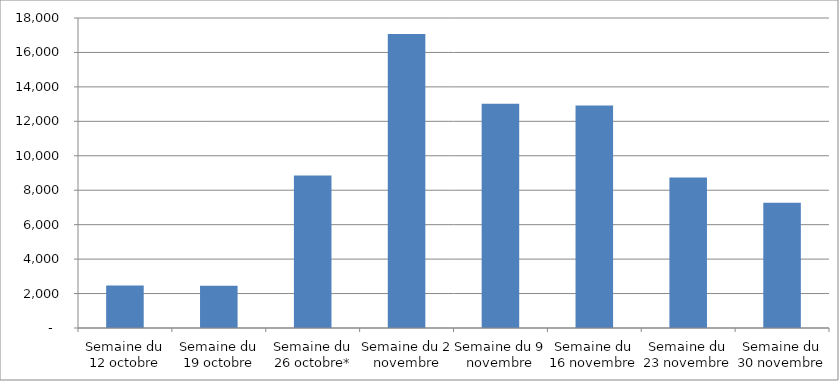
| Category | Series 0 |
|---|---|
| Semaine du 12 octobre | 2475 |
| Semaine du 19 octobre | 2449 |
| Semaine du 26 octobre* | 8849 |
| Semaine du 2 novembre | 17072 |
| Semaine du 9 novembre | 13023 |
| Semaine du 16 novembre | 12922 |
| Semaine du 23 novembre | 8732 |
| Semaine du 30 novembre | 7277 |